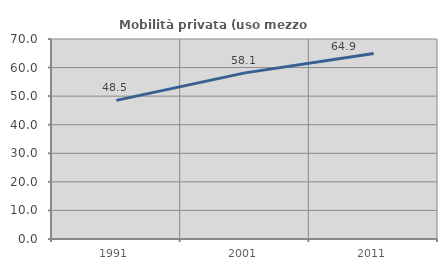
| Category | Mobilità privata (uso mezzo privato) |
|---|---|
| 1991.0 | 48.524 |
| 2001.0 | 58.14 |
| 2011.0 | 64.888 |